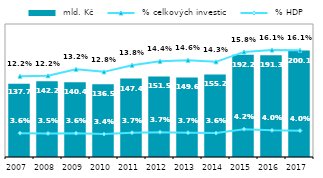
| Category |  mld. Kč |
|---|---|
| 2007.0 | 137.695 |
| 2008.0 | 142.235 |
| 2009.0 | 140.364 |
| 2010.0 | 136.519 |
| 2011.0 | 147.363 |
| 2012.0 | 151.504 |
| 2013.0 | 149.588 |
| 2014.0 | 155.156 |
| 2015.0 | 192.247 |
| 2016.0 | 191.276 |
| 2017.0 | 200.063 |